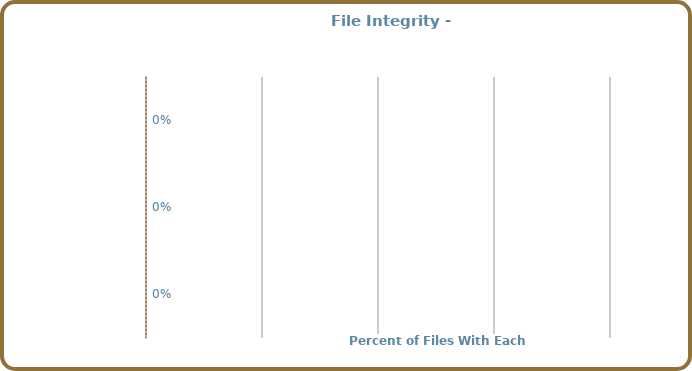
| Category | Completeness |
|---|---|
|  | 0 |
|  | 0 |
|  | 0 |